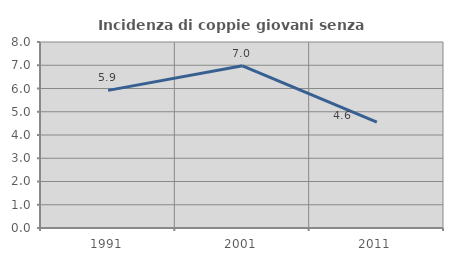
| Category | Incidenza di coppie giovani senza figli |
|---|---|
| 1991.0 | 5.92 |
| 2001.0 | 6.976 |
| 2011.0 | 4.556 |